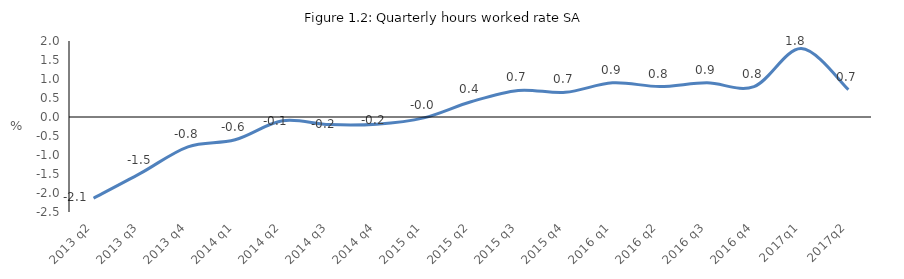
| Category | Series 0 |
|---|---|
| 2013 q2 | -2.137 |
| 2013 q3 | -1.478 |
| 2013 q4 | -0.785 |
| 2014 q1 | -0.6 |
| 2014 q2 | -0.1 |
| 2014 q3 | -0.2 |
| 2014 q4 | -0.189 |
| 2015 q1 | -0.023 |
| 2015 q2 | 0.4 |
| 2015 q3 | 0.7 |
| 2015 q4 | 0.65 |
| 2016 q1 | 0.9 |
| 2016 q2 | 0.8 |
| 2016 q3 | 0.9 |
| 2016 q4 | 0.8 |
| 2017q1 | 1.8 |
| 2017q2 | 0.72 |